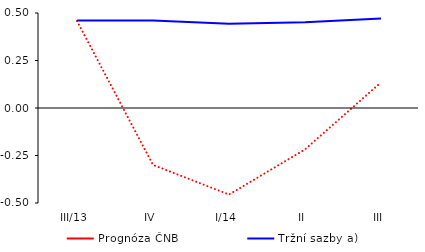
| Category | Prognóza ČNB | Tržní sazby a) |
|---|---|---|
| III/13 | 0.458 | 0.46 |
| IV | -0.299 | 0.46 |
| I/14 | -0.456 | 0.443 |
| II | -0.218 | 0.451 |
| III | 0.135 | 0.471 |